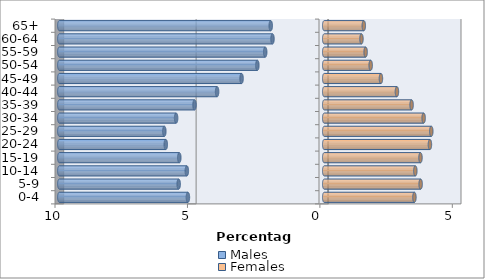
| Category | Males | Females |
|---|---|---|
| 0-4 | -5.146 | 3.405 |
| 5-9 | -5.494 | 3.64 |
| 10-14 | -5.187 | 3.44 |
| 15-19 | -5.471 | 3.634 |
| 20-24 | -5.982 | 3.99 |
| 25-29 | -6.036 | 4.043 |
| 30-34 | -5.591 | 3.753 |
| 35-39 | -4.896 | 3.299 |
| 40-44 | -4.044 | 2.745 |
| 45-49 | -3.12 | 2.141 |
| 50-54 | -2.524 | 1.754 |
| 55-59 | -2.228 | 1.563 |
| 60-64 | -1.953 | 1.406 |
| 65+ | -2.019 | 1.494 |